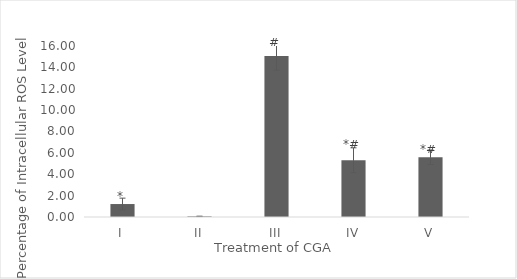
| Category | Series 0 |
|---|---|
| I | 1.213 |
| II | 0.06 |
| III | 15.063 |
| IV | 5.31 |
| V | 5.593 |